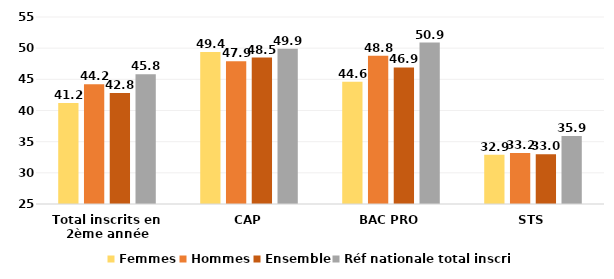
| Category | Femmes | Hommes | Ensemble | Réf nationale total inscrits |
|---|---|---|---|---|
| Total inscrits en 2ème année | 41.2 | 44.2 | 42.8 | 45.8 |
| CAP | 49.4 | 47.9 | 48.5 | 49.9 |
| BAC PRO | 44.6 | 48.8 | 46.9 | 50.9 |
| STS | 32.9 | 33.2 | 33 | 35.9 |